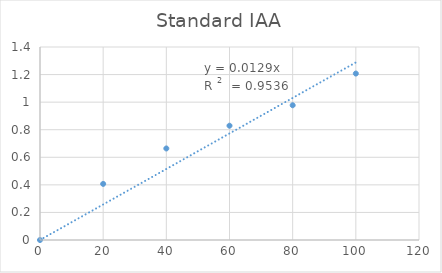
| Category | Abs 530nm (Average) |
|---|---|
| 0.0 | 0 |
| 20.0 | 0.407 |
| 40.0 | 0.664 |
| 60.0 | 0.829 |
| 80.0 | 0.978 |
| 100.0 | 1.207 |